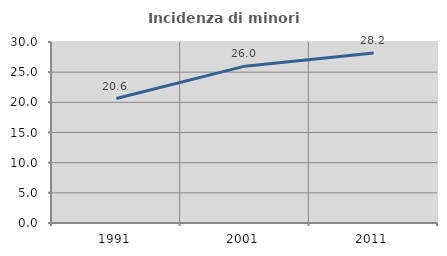
| Category | Incidenza di minori stranieri |
|---|---|
| 1991.0 | 20.63 |
| 2001.0 | 25.995 |
| 2011.0 | 28.161 |